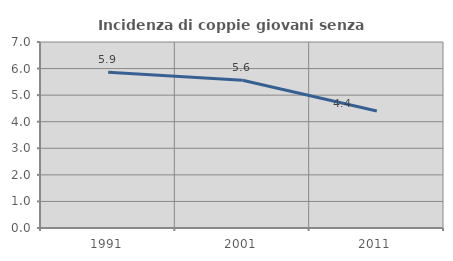
| Category | Incidenza di coppie giovani senza figli |
|---|---|
| 1991.0 | 5.864 |
| 2001.0 | 5.563 |
| 2011.0 | 4.405 |